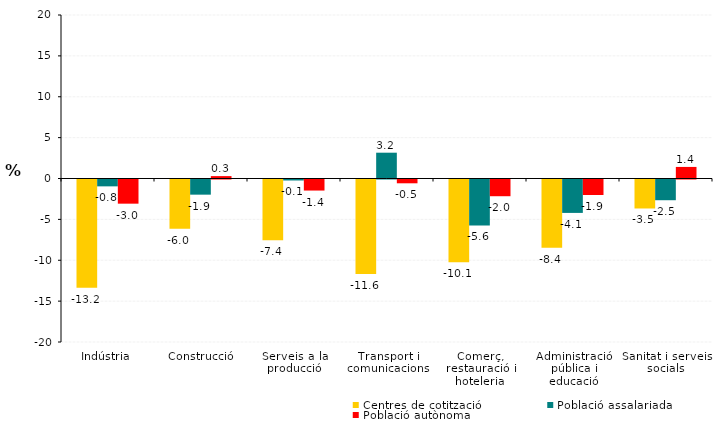
| Category | Centres de cotització | Població assalariada | Població autònoma |
|---|---|---|---|
| Indústria | -13.238 | -0.838 | -2.957 |
| Construcció | -6.029 | -1.854 | 0.293 |
| Serveis a la producció | -7.433 | -0.12 | -1.353 |
| Transport i comunicacions | -11.565 | 3.157 | -0.464 |
| Comerç, restauració i hoteleria | -10.131 | -5.613 | -2.046 |
| Administració pública i educació | -8.352 | -4.087 | -1.894 |
| Sanitat i serveis socials | -3.546 | -2.534 | 1.416 |